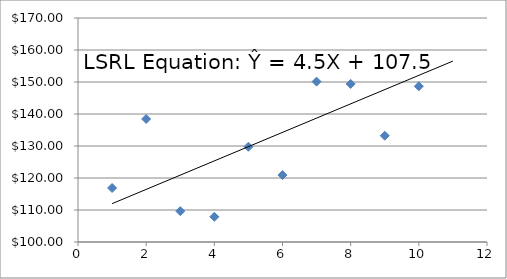
| Category | Series 0 |
|---|---|
| 1.0 | 116.89 |
| 2.0 | 138.45 |
| 3.0 | 109.65 |
| 4.0 | 107.87 |
| 5.0 | 129.76 |
| 6.0 | 120.91 |
| 7.0 | 150.12 |
| 8.0 | 149.4 |
| 9.0 | 133.21 |
| 10.0 | 148.67 |
| 11.0 | 171.92 |